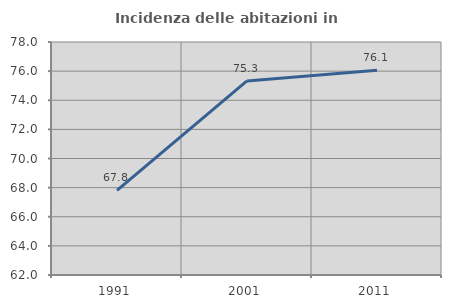
| Category | Incidenza delle abitazioni in proprietà  |
|---|---|
| 1991.0 | 67.816 |
| 2001.0 | 75.325 |
| 2011.0 | 76.056 |